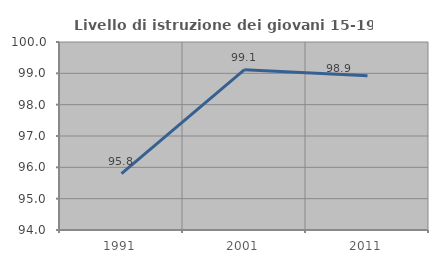
| Category | Livello di istruzione dei giovani 15-19 anni |
|---|---|
| 1991.0 | 95.798 |
| 2001.0 | 99.115 |
| 2011.0 | 98.925 |